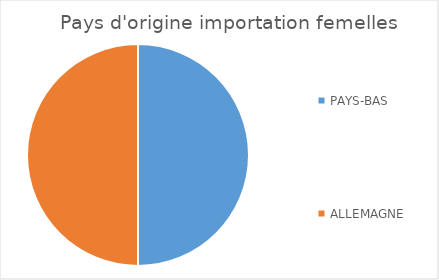
| Category | Series 0 |
|---|---|
| PAYS-BAS | 1 |
| ALLEMAGNE | 1 |